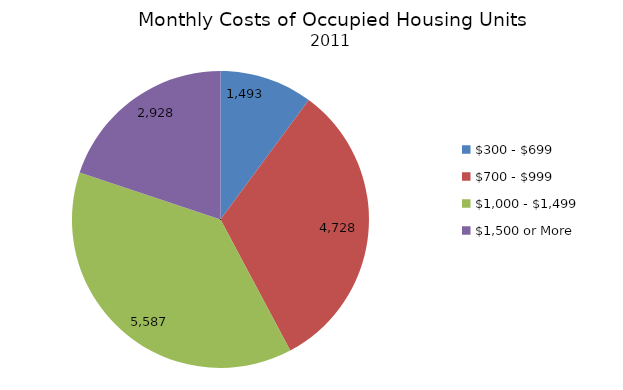
| Category | Series 0 | Series 1 | Series 2 | Series 3 |
|---|---|---|---|---|
| $300 - $699 | 1493 | 14736 | 0.101 |  |
| $700 - $999 | 4728 | 14736 | 0.321 |  |
| $1,000 - $1,499 | 5587 | 14736 | 0.379 |  |
| $1,500 or More | 2928 | 14736 | 0.199 |  |